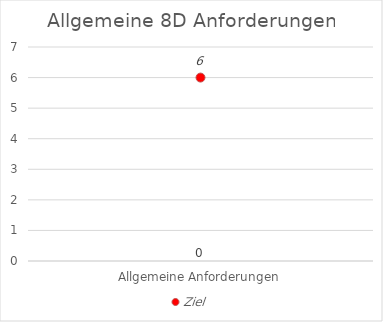
| Category | 8D Evaluation |
|---|---|
| Allgemeine Anforderungen | 0 |